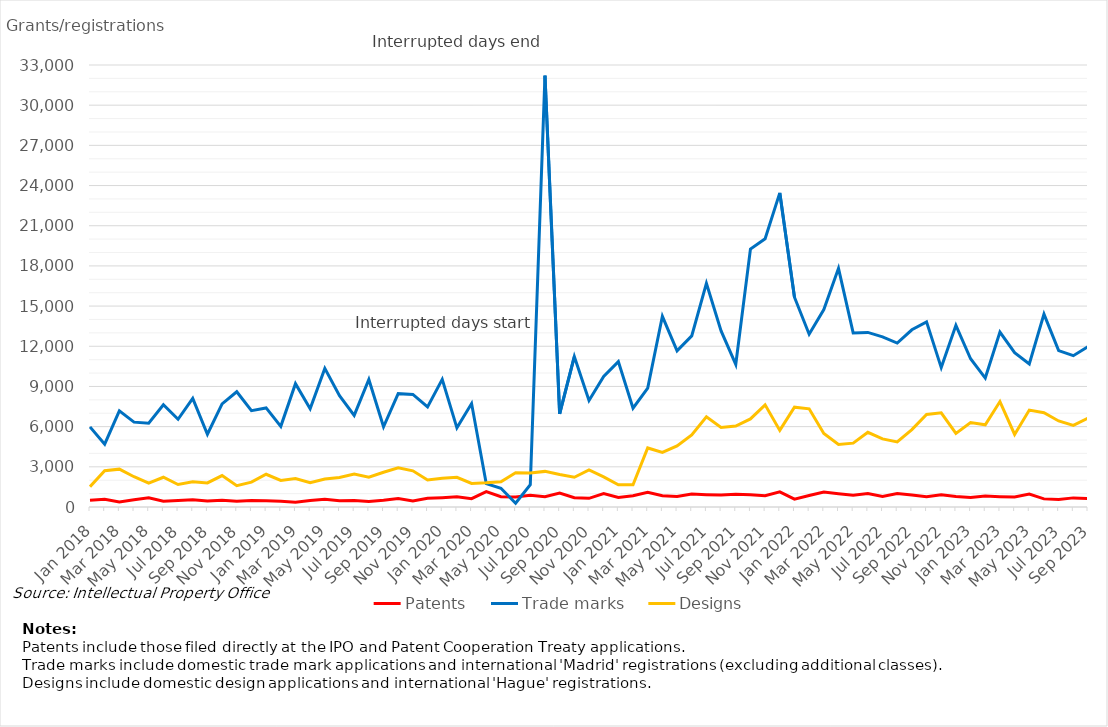
| Category | Patents | Trade marks | Designs |
|---|---|---|---|
| Jan 2018 | 495 | 5980 | 1512 |
| Feb 2018 | 574 | 4688 | 2704 |
| Mar 2018 | 370 | 7179 | 2825 |
| Apr 2018 | 543 | 6335 | 2259 |
| May 2018 | 690 | 6254 | 1789 |
| Jun 2018 | 424 | 7637 | 2222 |
| Jul 2018 | 486 | 6552 | 1678 |
| Aug 2018 | 536 | 8104 | 1878 |
| Sep 2018 | 450 | 5432 | 1795 |
| Oct 2018 | 498 | 7701 | 2348 |
| Nov 2018 | 432 | 8604 | 1592 |
| Dec 2018 | 484 | 7194 | 1859 |
| Jan 2019 | 474 | 7396 | 2444 |
| Feb 2019 | 426 | 6023 | 1987 |
| Mar 2019 | 363 | 9208 | 2125 |
| Apr 2019 | 488 | 7340 | 1810 |
| May 2019 | 573 | 10347 | 2096 |
| Jun 2019 | 471 | 8305 | 2202 |
| Jul 2019 | 489 | 6840 | 2464 |
| Aug 2019 | 420 | 9519 | 2218 |
| Sep 2019 | 500 | 5992 | 2596 |
| Oct 2019 | 634 | 8461 | 2926 |
| Nov 2019 | 455 | 8405 | 2700 |
| Dec 2019 | 654 | 7468 | 2021 |
| Jan 2020 | 696 | 9527 | 2145 |
| Feb 2020 | 756 | 5908 | 2219 |
| Mar 2020 | 622 | 7723 | 1757 |
| Apr 2020 | 1143 | 1743 | 1803 |
| May 2020 | 768 | 1399 | 1888 |
| Jun 2020 | 740 | 282 | 2564 |
| Jul 2020 | 878 | 1660 | 2539 |
| Aug 2020 | 771 | 32206 | 2659 |
| Sep 2020 | 1042 | 6950 | 2425 |
| Oct 2020 | 697 | 11227 | 2223 |
| Nov 2020 | 649 | 7958 | 2763 |
| Dec 2020 | 1010 | 9753 | 2252 |
| Jan 2021 | 708 | 10856 | 1665 |
| Feb 2021 | 838 | 7383 | 1660 |
| Mar 2021 | 1107 | 8878 | 4408 |
| Apr 2021 | 838 | 14236 | 4074 |
| May 2021 | 788 | 11655 | 4562 |
| Jun 2021 | 972 | 12774 | 5385 |
| Jul 2021 | 918 | 16699 | 6731 |
| Aug 2021 | 887 | 13151 | 5944 |
| Sep 2021 | 947 | 10649 | 6041 |
| Oct 2021 | 920 | 19256 | 6577 |
| Nov 2021 | 841 | 20030 | 7629 |
| Dec 2021 | 1131 | 23452 | 5719 |
| Jan 2022 | 585 | 15663 | 7455 |
| Feb 2022 | 860 | 12900 | 7329 |
| Mar 2022 | 1111 | 14746 | 5482 |
| Apr 2022 | 990 | 17822 | 4662 |
| May 2022 | 883 | 12996 | 4767 |
| Jun 2022 | 1010 | 13035 | 5577 |
| Jul 2022 | 788 | 12702 | 5082 |
| Aug 2022 | 1007 | 12238 | 4856 |
| Sep 2022 | 889 | 13231 | 5776 |
| Oct 2022 | 758 | 13820 | 6904 |
| Nov 2022 | 920 | 10407 | 7027 |
| Dec 2022 | 777 | 13565 | 5498 |
| Jan 2023 | 708 | 11068 | 6304 |
| Feb 2023 | 817 | 9626 | 6141 |
| Mar 2023 | 770 | 13064 | 7872 |
| Apr 2023 | 747 | 11526 | 5420 |
| May 2023 | 963 | 10678 | 7237 |
| Jun 2023 | 606 | 14401 | 7033 |
| Jul 2023 | 561 | 11672 | 6425 |
| Aug 2023 | 681 | 11299 | 6095 |
| Sep 2023 | 638 | 11968 | 6632 |